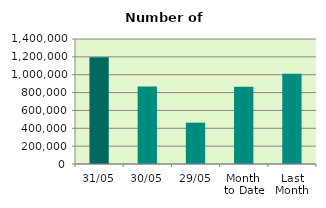
| Category | Series 0 |
|---|---|
| 31/05 | 1194208 |
| 30/05 | 866820 |
| 29/05 | 462682 |
| Month 
to Date | 864947.182 |
| Last
Month | 1010681.333 |